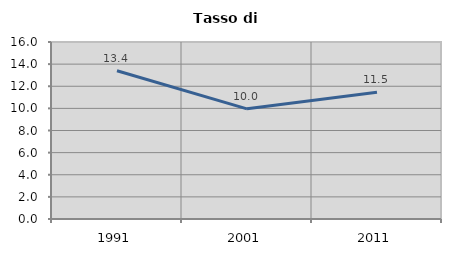
| Category | Tasso di disoccupazione   |
|---|---|
| 1991.0 | 13.396 |
| 2001.0 | 9.956 |
| 2011.0 | 11.451 |